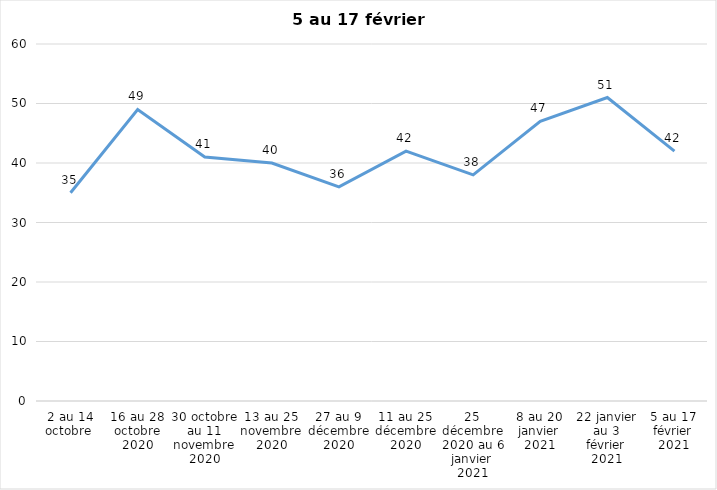
| Category | Toujours aux trois mesures |
|---|---|
| 2 au 14 octobre  | 35 |
| 16 au 28 octobre 2020 | 49 |
| 30 octobre au 11 novembre 2020 | 41 |
| 13 au 25 novembre 2020 | 40 |
| 27 au 9 décembre 2020 | 36 |
| 11 au 25 décembre 2020 | 42 |
| 25 décembre 2020 au 6 janvier 2021 | 38 |
| 8 au 20 janvier 2021 | 47 |
| 22 janvier au 3 février 2021 | 51 |
| 5 au 17 février 2021 | 42 |